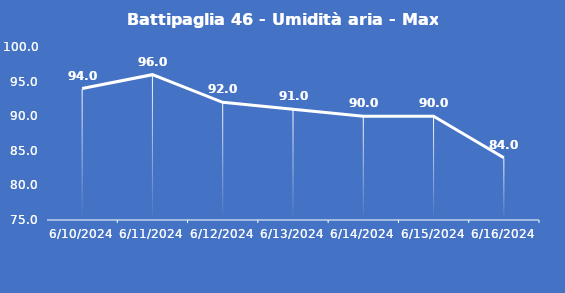
| Category | Battipaglia 46 - Umidità aria - Max (%) |
|---|---|
| 6/10/24 | 94 |
| 6/11/24 | 96 |
| 6/12/24 | 92 |
| 6/13/24 | 91 |
| 6/14/24 | 90 |
| 6/15/24 | 90 |
| 6/16/24 | 84 |